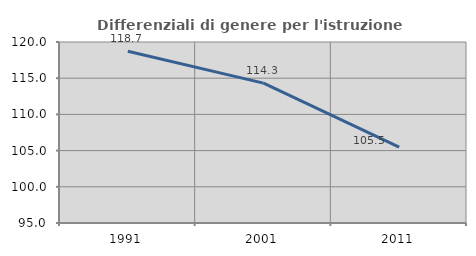
| Category | Differenziali di genere per l'istruzione superiore |
|---|---|
| 1991.0 | 118.711 |
| 2001.0 | 114.321 |
| 2011.0 | 105.479 |